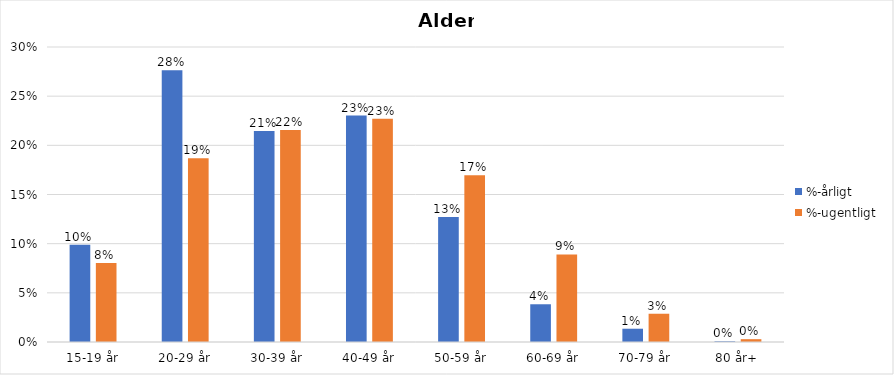
| Category | %-årligt | %-ugentligt |
|---|---|---|
| 15-19 år | 0.099 | 0.08 |
| 20-29 år | 0.276 | 0.187 |
| 30-39 år | 0.215 | 0.216 |
| 40-49 år | 0.23 | 0.227 |
| 50-59 år | 0.127 | 0.17 |
| 60-69 år | 0.038 | 0.089 |
| 70-79 år | 0.014 | 0.029 |
| 80 år+ | 0.001 | 0.003 |